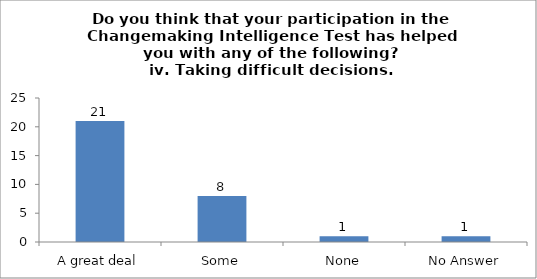
| Category | Do you think that your participation in the Changemaking Intelligence Test has helped you with any of the following?
iv. Taking difficult decisions. |
|---|---|
| A great deal | 21 |
| Some | 8 |
| None | 1 |
| No Answer | 1 |